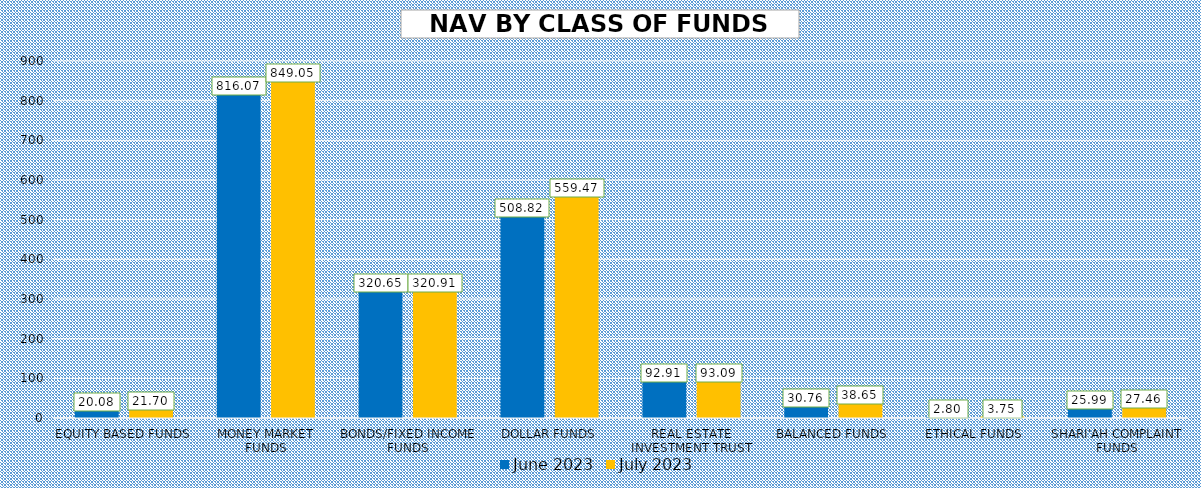
| Category | June 2023 | July 2023 |
|---|---|---|
| EQUITY BASED FUNDS | 20.084 | 21.704 |
| MONEY MARKET FUNDS | 816.072 | 849.053 |
| BONDS/FIXED INCOME FUNDS | 320.654 | 320.911 |
| DOLLAR FUNDS | 508.823 | 559.469 |
| REAL ESTATE INVESTMENT TRUST | 92.907 | 93.087 |
| BALANCED FUNDS | 30.762 | 38.647 |
| ETHICAL FUNDS | 2.8 | 3.748 |
| SHARI'AH COMPLAINT FUNDS | 25.988 | 27.459 |